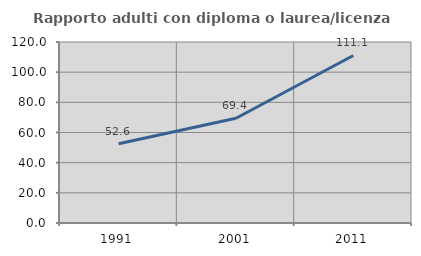
| Category | Rapporto adulti con diploma o laurea/licenza media  |
|---|---|
| 1991.0 | 52.587 |
| 2001.0 | 69.417 |
| 2011.0 | 111.066 |